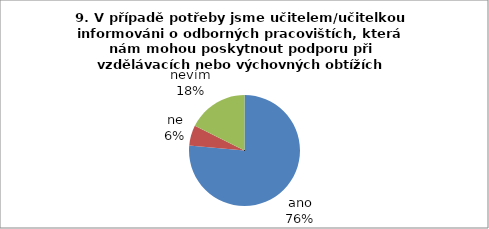
| Category | 9. |
|---|---|
| ano | 26 |
| ne | 2 |
| nevím | 6 |